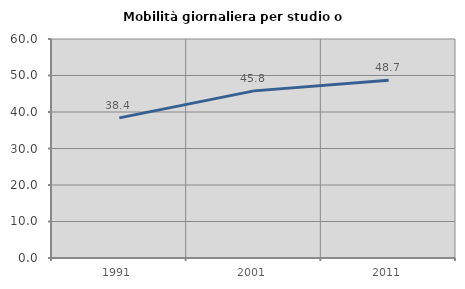
| Category | Mobilità giornaliera per studio o lavoro |
|---|---|
| 1991.0 | 38.39 |
| 2001.0 | 45.788 |
| 2011.0 | 48.689 |